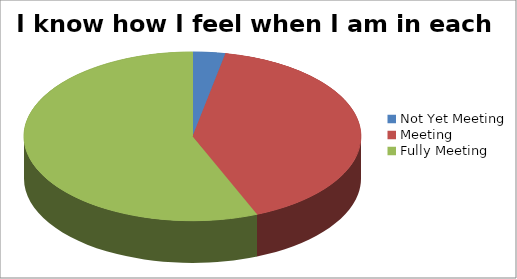
| Category | I know how I feel when I am in each zone |
|---|---|
| Not Yet Meeting | 1 |
| Meeting | 13 |
| Fully Meeting | 18 |